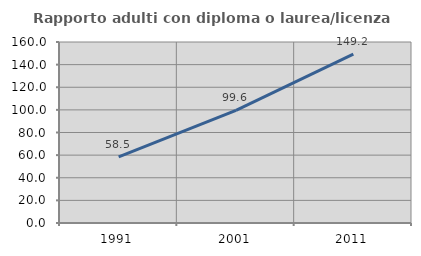
| Category | Rapporto adulti con diploma o laurea/licenza media  |
|---|---|
| 1991.0 | 58.537 |
| 2001.0 | 99.581 |
| 2011.0 | 149.206 |